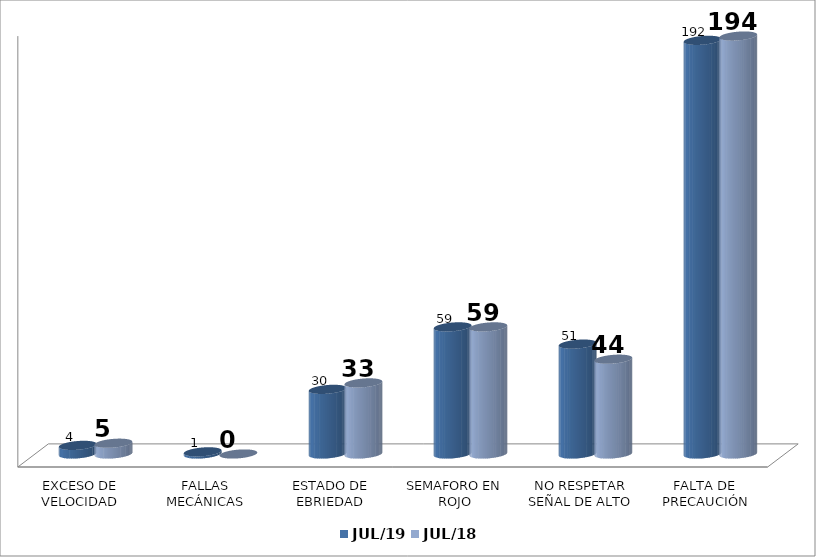
| Category | JUL/19 | JUL/18 |
|---|---|---|
| EXCESO DE VELOCIDAD | 4 | 5 |
| FALLAS MECÁNICAS | 1 | 0 |
| ESTADO DE EBRIEDAD | 30 | 33 |
| SEMAFORO EN ROJO | 59 | 59 |
| NO RESPETAR SEÑAL DE ALTO | 51 | 44 |
| FALTA DE PRECAUCIÓN | 192 | 194 |